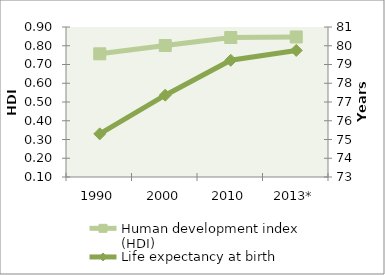
| Category | Human development index (HDI) |
|---|---|
| 1990 | 0.757 |
| 2000 | 0.801 |
| 2010 | 0.844 |
| 2013* | 0.847 |